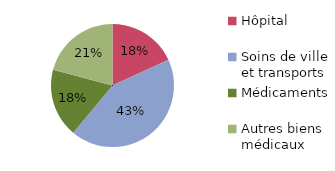
| Category | 2014 |
|---|---|
| Hôpital | 0.182 |
| Soins de ville et transports | 0.429 |
| Médicaments | 0.18 |
| Autres biens médicaux | 0.209 |